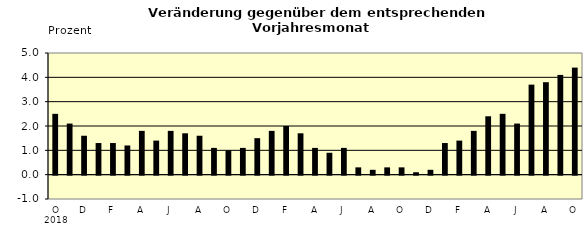
| Category | Series 0 |
|---|---|
| 0 | 2.5 |
| 1 | 2.1 |
| 2 | 1.6 |
| 3 | 1.3 |
| 4 | 1.3 |
| 5 | 1.2 |
| 6 | 1.8 |
| 7 | 1.4 |
| 8 | 1.8 |
| 9 | 1.7 |
| 10 | 1.6 |
| 11 | 1.1 |
| 12 | 1 |
| 13 | 1.1 |
| 14 | 1.5 |
| 15 | 1.8 |
| 16 | 2 |
| 17 | 1.7 |
| 18 | 1.1 |
| 19 | 0.9 |
| 20 | 1.1 |
| 21 | 0.3 |
| 22 | 0.2 |
| 23 | 0.3 |
| 24 | 0.3 |
| 25 | 0.1 |
| 26 | 0.2 |
| 27 | 1.3 |
| 28 | 1.4 |
| 29 | 1.8 |
| 30 | 2.4 |
| 31 | 2.5 |
| 32 | 2.1 |
| 33 | 3.7 |
| 34 | 3.8 |
| 35 | 4.1 |
| 36 | 4.4 |